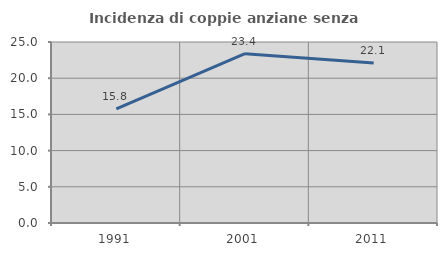
| Category | Incidenza di coppie anziane senza figli  |
|---|---|
| 1991.0 | 15.758 |
| 2001.0 | 23.39 |
| 2011.0 | 22.093 |